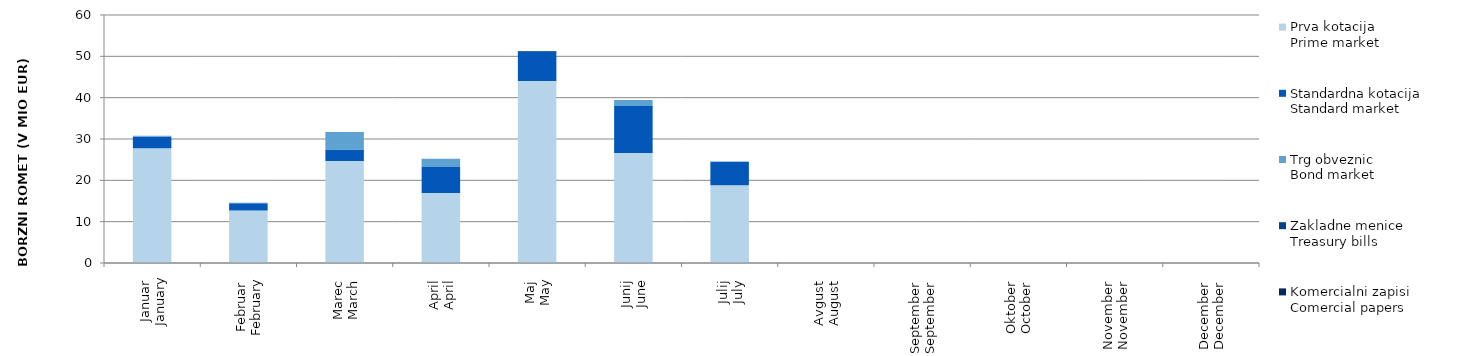
| Category | Prva kotacija
Prime market | Standardna kotacija
Standard market | Trg obveznic
Bond market | Zakladne menice
Treasury bills | Komercialni zapisi
Comercial papers |
|---|---|---|---|---|---|
| Januar
January | 27.745 | 2.796 | 0.249 | 0 | 0 |
| Februar
February | 12.685 | 1.784 | 0.118 | 0 | 0 |
| Marec
March | 24.676 | 2.813 | 4.174 | 0 | 0 |
| April
April | 16.942 | 6.272 | 2.01 | 0 | 0 |
| Maj
May | 44.02 | 7.1 | 0 | 0.145 | 0 |
| Junij
June | 26.612 | 11.39 | 1.425 | 0 | 0 |
| Julij
July | 18.826 | 5.646 | 0.075 | 0 | 0 |
| Avgust
August | 0 | 0 | 0 | 0 | 0 |
| September
September | 0 | 0 | 0 | 0 | 0 |
| Oktober
October | 0 | 0 | 0 | 0 | 0 |
| November
November | 0 | 0 | 0 | 0 | 0 |
| December
December | 0 | 0 | 0 | 0 | 0 |